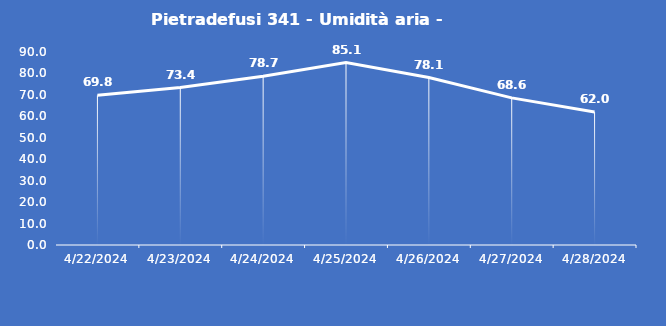
| Category | Pietradefusi 341 - Umidità aria - Grezzo (%) |
|---|---|
| 4/22/24 | 69.8 |
| 4/23/24 | 73.4 |
| 4/24/24 | 78.7 |
| 4/25/24 | 85.1 |
| 4/26/24 | 78.1 |
| 4/27/24 | 68.6 |
| 4/28/24 | 62 |